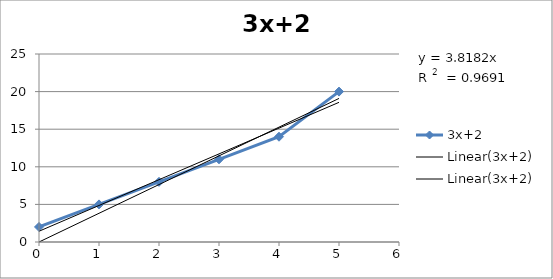
| Category | 3x+2 |
|---|---|
| 0.0 | 2 |
| 1.0 | 5 |
| 2.0 | 8 |
| 3.0 | 11 |
| 4.0 | 14 |
| 5.0 | 20 |